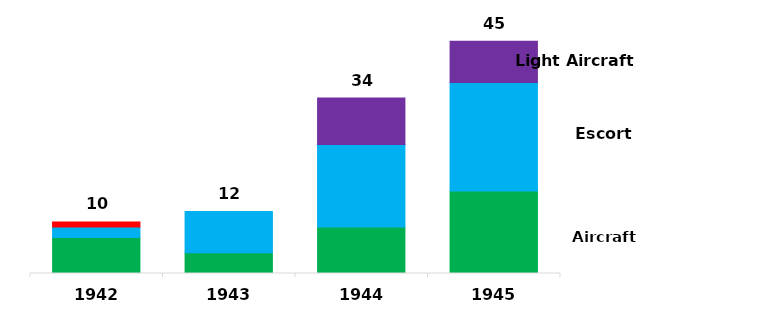
| Category | Series 0 | Series 1 | Series 2 | Series 3 |
|---|---|---|---|---|
| 1942 | 7 | 2 | 0 | 1 |
| 1943 | 4 | 8 | 0 | 0 |
| 1944 | 9 | 16 | 9 | 0 |
| 1945 | 16 | 21 | 8 | 0 |